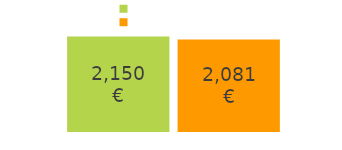
| Category | Einnahmen | Ausgaben |
|---|---|---|
| Einnahmen: | 2150 | 2081 |